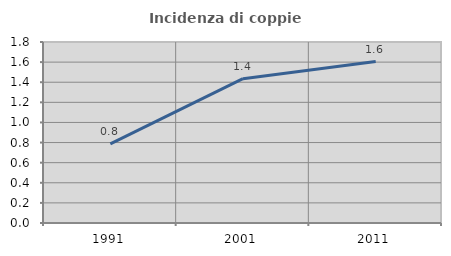
| Category | Incidenza di coppie miste |
|---|---|
| 1991.0 | 0.787 |
| 2001.0 | 1.436 |
| 2011.0 | 1.605 |